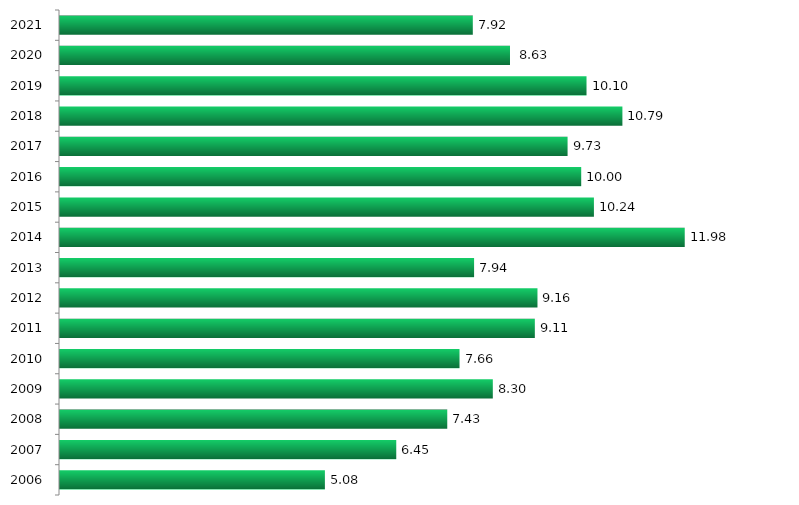
| Category | Series 0 |
|---|---|
| 2006.0 | 5.08 |
| 2007.0 | 6.449 |
| 2008.0 | 7.427 |
| 2009.0 | 8.301 |
| 2010.0 | 7.662 |
| 2011.0 | 9.106 |
| 2012.0 | 9.157 |
| 2013.0 | 7.941 |
| 2014.0 | 11.981 |
| 2015.0 | 10.24 |
| 2016.0 | 9.996 |
| 2017.0 | 9.734 |
| 2018.0 | 10.786 |
| 2019.0 | 10.098 |
| 2020.0 | 8.63 |
| 2021.0 | 7.917 |